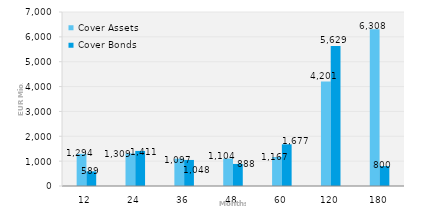
| Category | Cover Assets | Cover Bonds |
|---|---|---|
| 12.0 | 1293.908 | 588.562 |
| 24.0 | 1309.086 | 1410.968 |
| 36.0 | 1097.265 | 1048 |
| 48.0 | 1103.861 | 888 |
| 60.0 | 1166.878 | 1676.5 |
| 120.0 | 4200.998 | 5629.025 |
| 180.0 | 6308.022 | 800.433 |